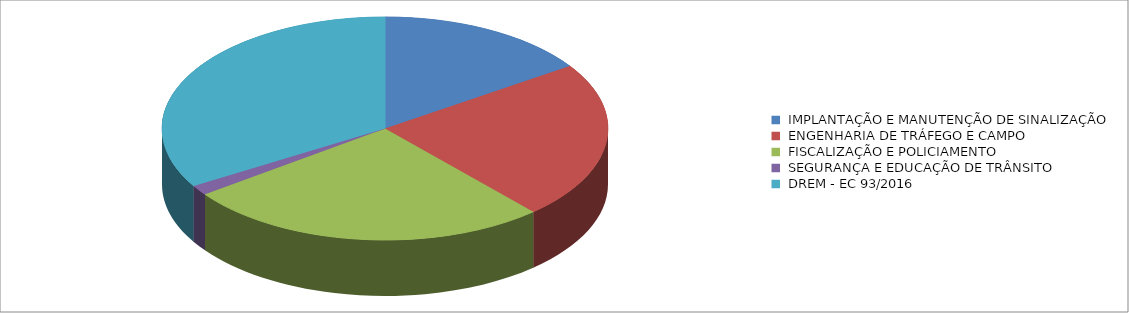
| Category | Series 0 | Series 1 |
|---|---|---|
| IMPLANTAÇÃO E MANUTENÇÃO DE SINALIZAÇÃO | 15313471.447 |  |
| ENGENHARIA DE TRÁFEGO E CAMPO | 22567323.398 |  |
| FISCALIZAÇÃO E POLICIAMENTO | 26136350.168 |  |
| SEGURANÇA E EDUCAÇÃO DE TRÂNSITO | 1423926.587 |  |
| DREM - EC 93/2016 | 33125299.83 |  |